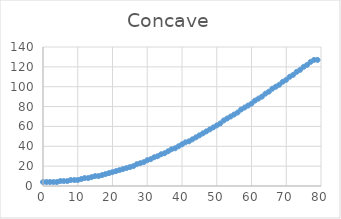
| Category | Series 0 |
|---|---|
| 0.0 | 4 |
| 1.0 | 4 |
| 2.0 | 4 |
| 3.0 | 4 |
| 4.0 | 4 |
| 5.0 | 5 |
| 6.0 | 5 |
| 7.0 | 5 |
| 8.0 | 6 |
| 9.0 | 6 |
| 10.0 | 6 |
| 11.0 | 7 |
| 12.0 | 8 |
| 13.0 | 8 |
| 14.0 | 9 |
| 15.0 | 10 |
| 16.0 | 10 |
| 17.0 | 11 |
| 18.0 | 12 |
| 19.0 | 13 |
| 20.0 | 14 |
| 21.0 | 15 |
| 22.0 | 16 |
| 23.0 | 17 |
| 24.0 | 18 |
| 25.0 | 19 |
| 26.0 | 20 |
| 27.0 | 22 |
| 28.0 | 23 |
| 29.0 | 24 |
| 30.0 | 26 |
| 31.0 | 27 |
| 32.0 | 29 |
| 33.0 | 30 |
| 34.0 | 32 |
| 35.0 | 33 |
| 36.0 | 35 |
| 37.0 | 37 |
| 38.0 | 38 |
| 39.0 | 40 |
| 40.0 | 42 |
| 41.0 | 44 |
| 42.0 | 45 |
| 43.0 | 47 |
| 44.0 | 49 |
| 45.0 | 51 |
| 46.0 | 53 |
| 47.0 | 55 |
| 48.0 | 57 |
| 49.0 | 59 |
| 50.0 | 61 |
| 51.0 | 63 |
| 52.0 | 66 |
| 53.0 | 68 |
| 54.0 | 70 |
| 55.0 | 72 |
| 56.0 | 74 |
| 57.0 | 77 |
| 58.0 | 79 |
| 59.0 | 81 |
| 60.0 | 83 |
| 61.0 | 86 |
| 62.0 | 88 |
| 63.0 | 90 |
| 64.0 | 93 |
| 65.0 | 95 |
| 66.0 | 98 |
| 67.0 | 100 |
| 68.0 | 102 |
| 69.0 | 105 |
| 70.0 | 107 |
| 71.0 | 110 |
| 72.0 | 112 |
| 73.0 | 115 |
| 74.0 | 117 |
| 75.0 | 120 |
| 76.0 | 122 |
| 77.0 | 125 |
| 78.0 | 127 |
| 79.0 | 127 |